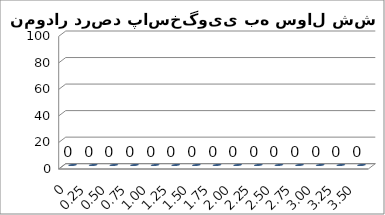
| Category | نمودار سوال یک |
|---|---|
| 0.0 | 0 |
| 0.25 | 0 |
| 0.5 | 0 |
| 0.75 | 0 |
| 1.0 | 0 |
| 1.25 | 0 |
| 1.5 | 0 |
| 1.75 | 0 |
| 2.0 | 0 |
| 2.25 | 0 |
| 2.5 | 0 |
| 2.75 | 0 |
| 3.0 | 0 |
| 3.25 | 0 |
| 3.5 | 0 |